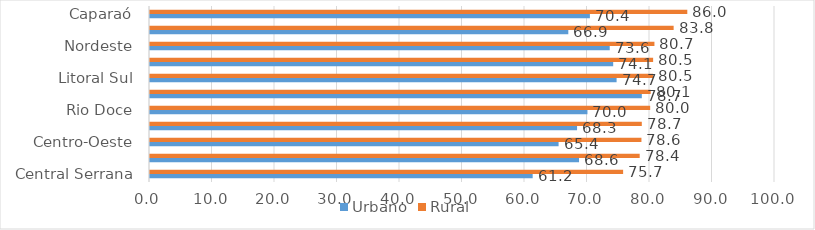
| Category | Urbano | Rural |
|---|---|---|
| Central Serrana | 61.227 | 75.7 |
| Noroeste | 68.646 | 78.352 |
| Centro-Oeste | 65.374 | 78.631 |
| Central Sul | 68.331 | 78.688 |
| Rio Doce | 69.993 | 80.028 |
| Metropolitana | 78.691 | 80.105 |
| Litoral Sul | 74.654 | 80.477 |
| ESPÍRITO SANTO | 74.11 | 80.499 |
| Nordeste | 73.555 | 80.71 |
| Sudoeste Serrana | 66.929 | 83.783 |
| Caparaó | 70.383 | 85.967 |